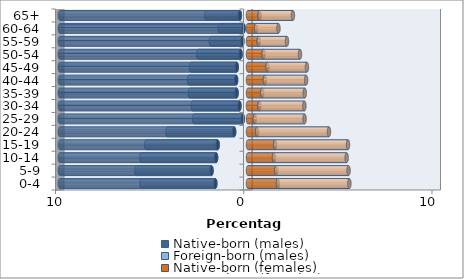
| Category | Native-born (males) | Foreign-born (males) | Native-born (females) | Foreign-born (females) |
|---|---|---|---|---|
| 0-4 | -1.735 | -3.925 | 1.59 | 3.794 |
| 5-9 | -1.938 | -3.99 | 1.503 | 3.839 |
| 10-14 | -1.695 | -3.981 | 1.38 | 3.861 |
| 15-19 | -1.612 | -3.792 | 1.441 | 3.87 |
| 20-24 | -0.736 | -3.549 | 0.486 | 3.816 |
| 25-29 | -0.277 | -2.587 | 0.363 | 2.641 |
| 30-34 | -0.453 | -2.484 | 0.609 | 2.386 |
| 35-39 | -0.607 | -2.48 | 0.754 | 2.261 |
| 40-44 | -0.631 | -2.507 | 0.897 | 2.19 |
| 45-49 | -0.598 | -2.427 | 1.037 | 2.094 |
| 50-54 | -0.395 | -2.248 | 0.825 | 1.936 |
| 55-59 | -0.299 | -1.675 | 0.567 | 1.503 |
| 60-64 | -0.236 | -1.271 | 0.431 | 1.186 |
| 65+ | -0.431 | -1.795 | 0.618 | 1.769 |